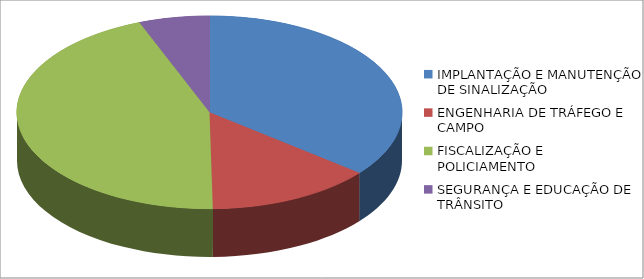
| Category | Series 0 | Series 1 |
|---|---|---|
| IMPLANTAÇÃO E MANUTENÇÃO DE SINALIZAÇÃO | 2458232.2 |  |
| ENGENHARIA DE TRÁFEGO E CAMPO | 954290.28 |  |
| FISCALIZAÇÃO E POLICIAMENTO | 3043645.06 |  |
| SEGURANÇA E EDUCAÇÃO DE TRÂNSITO | 406587.3 |  |